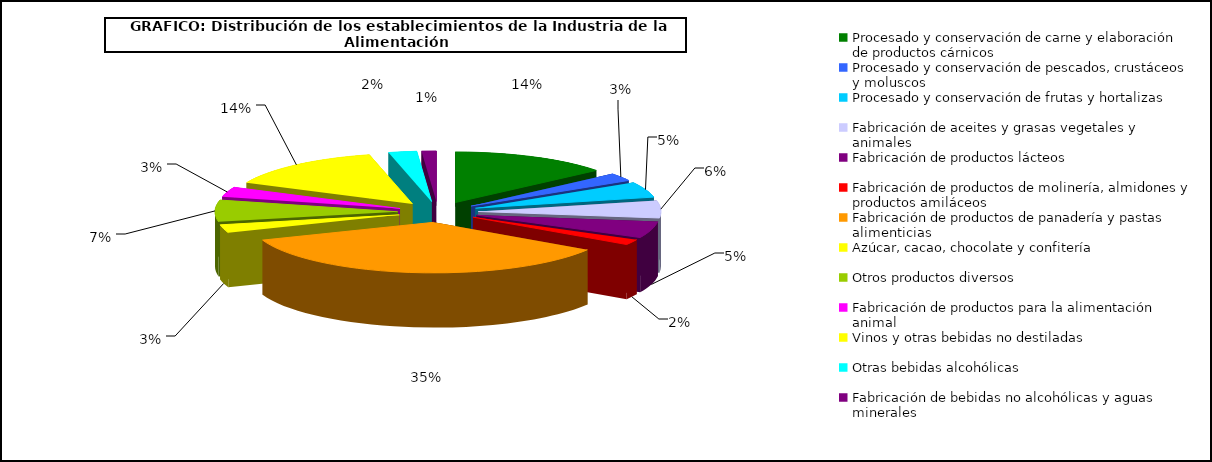
| Category | Series 0 |
|---|---|
| Procesado y conservación de carne y elaboración de productos cárnicos | 4654 |
| Procesado y conservación de pescados, crustáceos y moluscos | 838 |
| Procesado y conservación de frutas y hortalizas | 1633 |
| Fabricación de aceites y grasas vegetales y animales | 1845 |
| Fabricación de productos lácteos | 1759 |
| Fabricación de productos de molinería, almidones y productos amiláceos | 583 |
| Fabricación de productos de panadería y pastas alimenticias | 11662 |
| Azúcar, cacao, chocolate y confitería | 846 |
| Otros productos diversos | 2286 |
| Fabricación de productos para la alimentación animal | 1053 |
| Vinos y otras bebidas no destiladas | 4747 |
| Otras bebidas alcohólicas | 827 |
| Fabricación de bebidas no alcohólicas y aguas minerales | 430 |